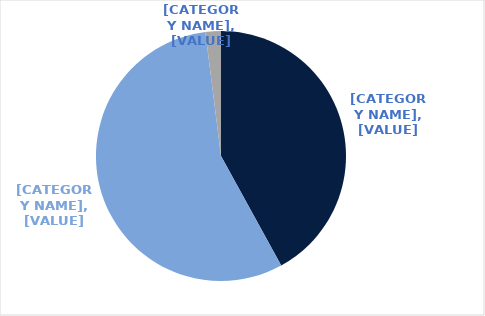
| Category | Series 0 |
|---|---|
| Premium | 0.42 |
| A Grade | 0.56 |
| B Grade | 0.02 |